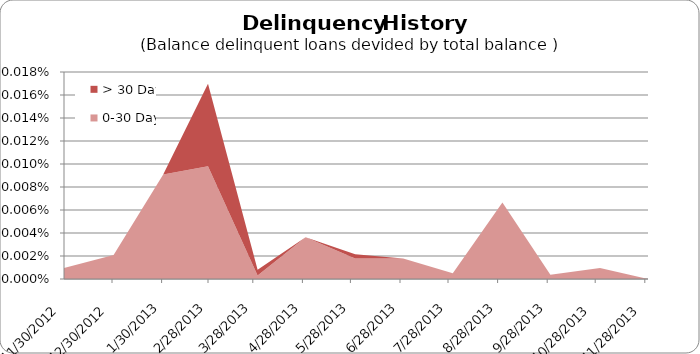
| Category | 0-30 Days | > 30 Days |
|---|---|---|
| 11/30/12 | 0 | 0 |
| 12/31/12 | 0 | 0 |
| 1/31/13 | 0 | 0 |
| 2/28/13 | 0 | 0 |
| 3/31/13 | 0 | 0 |
| 4/30/13 | 0 | 0 |
| 5/31/13 | 0 | 0 |
| 6/30/13 | 0 | 0 |
| 7/31/13 | 0 | 0 |
| 8/31/13 | 0 | 0 |
| 9/30/13 | 0 | 0 |
| 10/31/13 | 0 | 0 |
| 11/30/13 | 0 | 0 |